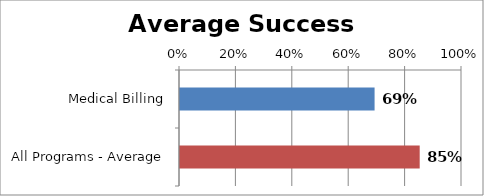
| Category | RetentionRate |
|---|---|
| Medical Billing | 0.69 |
| All Programs - Average | 0.85 |